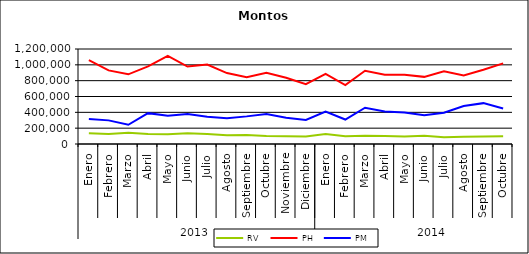
| Category | RV | PH | PM |
|---|---|---|---|
| 0 | 136808.804 | 1058774.967 | 316751.291 |
| 1 | 127193.421 | 930111.334 | 298480.292 |
| 2 | 142052.509 | 880100.908 | 242691.68 |
| 3 | 126637.277 | 980038.371 | 389833.89 |
| 4 | 123189.846 | 1112542.201 | 355777.139 |
| 5 | 135184.022 | 977877.296 | 379782.022 |
| 6 | 127790.361 | 1003315.643 | 342842.568 |
| 7 | 110532.346 | 895717.973 | 326616.455 |
| 8 | 114630.859 | 843607.598 | 348985.725 |
| 9 | 102262.08 | 901170.281 | 379642.157 |
| 10 | 99242.352 | 837424.505 | 330278.777 |
| 11 | 96243.301 | 754952.55 | 304473.582 |
| 12 | 124770.971 | 885857.327 | 408057.686 |
| 13 | 96987.292 | 744736.746 | 309218.036 |
| 14 | 103624.997 | 925209.281 | 458118.752 |
| 15 | 100007.683 | 874534.649 | 410841.727 |
| 16 | 96199.147 | 875356.86 | 399197.561 |
| 17 | 104965.63 | 848001.408 | 363776.247 |
| 18 | 85979.134 | 918529.646 | 394798.235 |
| 19 | 91006.222 | 867037.612 | 479726.319 |
| 20 | 95061.186 | 938312.305 | 516086.875 |
| 21 | 98427.295 | 1018217.103 | 448738.646 |